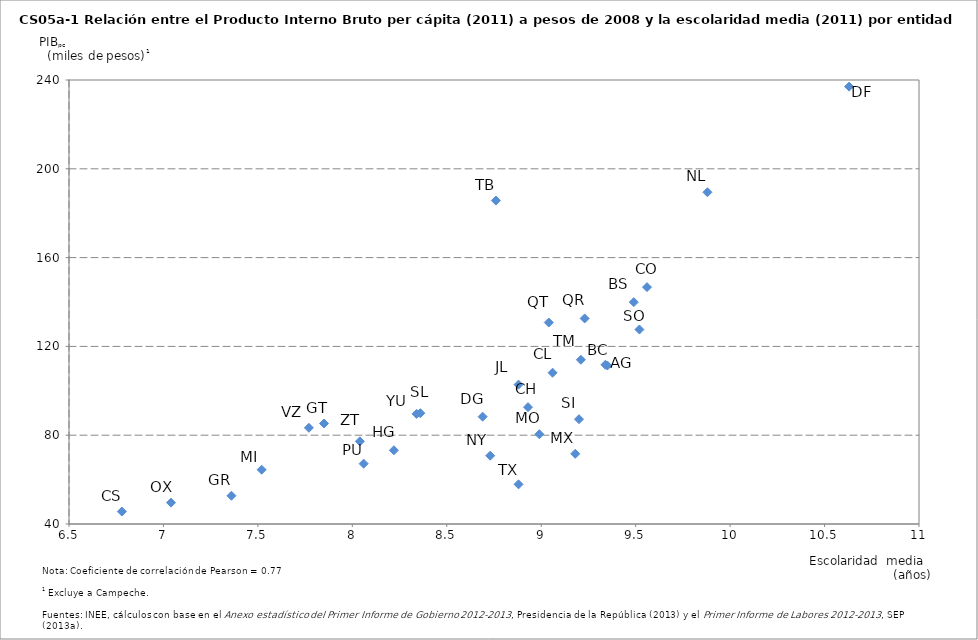
| Category | PIBpc |
|---|---|
| 9.34 | 111.745 |
| 9.35 | 111.376 |
| 9.49 | 139.948 |
| 9.56 | 146.695 |
| 9.06 | 108.143 |
| 6.78 | 45.604 |
| 8.93 | 92.621 |
| 10.63 | 237.014 |
| 8.69 | 88.347 |
| 7.85 | 85.267 |
| 7.36 | 52.727 |
| 8.22 | 73.201 |
| 8.88 | 102.786 |
| 9.18 | 71.627 |
| 7.52 | 64.453 |
| 8.99 | 80.428 |
| 8.73 | 70.768 |
| 9.88 | 189.451 |
| 7.04 | 49.614 |
| 8.06 | 67.176 |
| 9.04 | 130.754 |
| 9.23 | 132.593 |
| 8.36 | 89.909 |
| 9.2 | 87.21 |
| 9.52 | 127.598 |
| 8.76 | 185.705 |
| 9.21 | 113.99 |
| 8.88 | 57.871 |
| 7.77 | 83.33 |
| 8.34 | 89.614 |
| 8.04 | 77.23 |